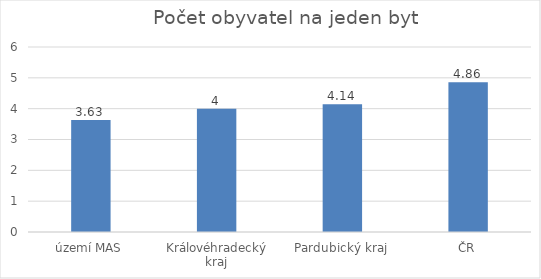
| Category | Series 0 |
|---|---|
| území MAS | 3.63 |
| Královéhradecký kraj | 4 |
| Pardubický kraj | 4.14 |
| ČR | 4.86 |